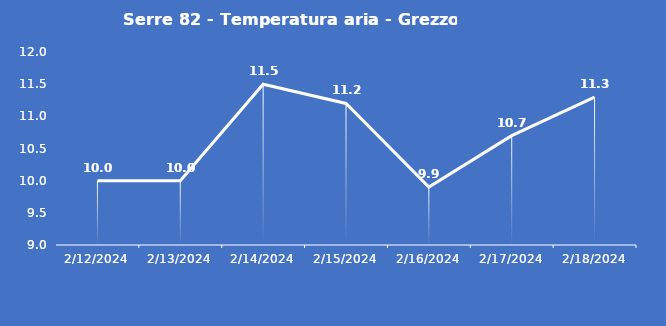
| Category | Serre 82 - Temperatura aria - Grezzo (°C) |
|---|---|
| 2/12/24 | 10 |
| 2/13/24 | 10 |
| 2/14/24 | 11.5 |
| 2/15/24 | 11.2 |
| 2/16/24 | 9.9 |
| 2/17/24 | 10.7 |
| 2/18/24 | 11.3 |